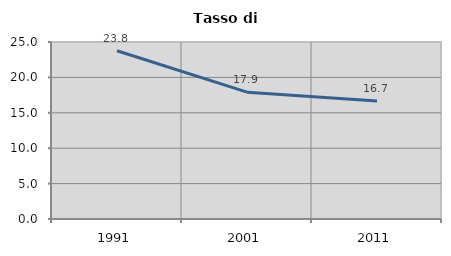
| Category | Tasso di disoccupazione   |
|---|---|
| 1991.0 | 23.765 |
| 2001.0 | 17.917 |
| 2011.0 | 16.674 |